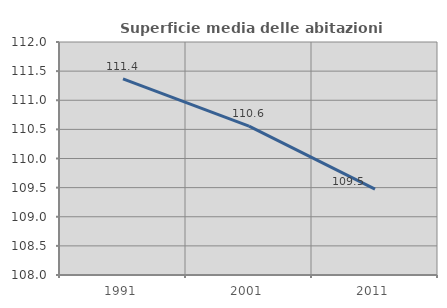
| Category | Superficie media delle abitazioni occupate |
|---|---|
| 1991.0 | 111.368 |
| 2001.0 | 110.555 |
| 2011.0 | 109.474 |